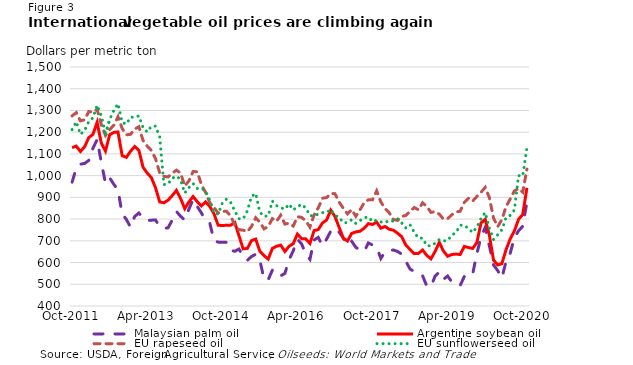
| Category | Malaysian | Argentine | EU |
|---|---|---|---|
| 2011-10-01 | 970 | 1129 | 1212 |
| 2011-11-01 | 1034 | 1136 | 1248 |
| 2011-12-01 | 1053 | 1111 | 1190 |
| 2012-01-01 | 1056 | 1133 | 1208 |
| 2012-02-01 | 1070 | 1175 | 1249 |
| 2012-03-01 | 1126 | 1190 | 1266 |
| 2012-04-01 | 1166 | 1245 | 1324 |
| 2012-05-01 | 1062 | 1150 | 1275 |
| 2012-06-01 | 965 | 1113 | 1192 |
| 2012-07-01 | 990 | 1188 | 1258 |
| 2012-08-01 | 960 | 1199 | 1300 |
| 2012-09-01 | 935 | 1201 | 1331 |
| 2012-10-01 | 823 | 1092 | 1245 |
| 2012-11-01 | 799 | 1084 | 1237 |
| 2012-12-01 | 763 | 1112 | 1269 |
| 2013-01-01 | 812 | 1134 | 1269 |
| 2013-02-01 | 828 | 1117 | 1275 |
| 2013-03-01 | 804 | 1039 | 1221 |
| 2013-04-01 | 793 | 1012 | 1201 |
| 2013-05-01 | 795 | 991 | 1227 |
| 2013-06-01 | 796 | 944 | 1228 |
| 2013-07-01 | 765 | 879 | 1178 |
| 2013-08-01 | 757 | 875 | 959 |
| 2013-09-01 | 760 | 887 | 962 |
| 2013-10-01 | 795 | 908 | 988 |
| 2013-11-01 | 835 | 932 | 998 |
| 2013-12-01 | 813 | 895 | 982 |
| 2014-01-01 | 796 | 848 | 920 |
| 2014-02-01 | 846 | 879 | 945 |
| 2014-03-01 | 890 | 904 | 964 |
| 2014-04-01 | 858 | 880 | 941 |
| 2014-05-01 | 828 | 861 | 943 |
| 2014-06-01 | 793 | 879 | 928 |
| 2014-07-01 | 782 | 858 | 887 |
| 2014-08-01 | 701 | 825 | 828 |
| 2014-09-01 | 694 | 772 | 823 |
| 2014-10-01 | 693 | 770 | 874 |
| 2014-11-01 | 693 | 772 | 892 |
| 2014-12-01 | 656 | 772 | 877 |
| 2015-01-01 | 652 | 784 | 837 |
| 2015-02-01 | 662 | 723 | 802 |
| 2015-03-01 | 629 | 663 | 801 |
| 2015-04-01 | 610 | 665 | 838 |
| 2015-05-01 | 628 | 701 | 904 |
| 2015-06-01 | 638 | 708 | 918 |
| 2015-07-01 | 610 | 652 | 832 |
| 2015-08-01 | 524 | 632 | 812 |
| 2015-09-01 | 521 | 616 | 815 |
| 2015-10-01 | 565 | 665 | 883 |
| 2015-11-01 | 541 | 675 | 862 |
| 2015-12-01 | 539 | 680 | 852 |
| 2016-01-01 | 550 | 651 | 846 |
| 2016-02-01 | 613 | 675 | 869 |
| 2016-03-01 | 654 | 687 | 842 |
| 2016-04-01 | 707 | 731 | 857 |
| 2016-05-01 | 686 | 710 | 868 |
| 2016-06-01 | 640 | 709 | 851 |
| 2016-07-01 | 615 | 688 | 816 |
| 2016-08-01 | 704 | 747 | 815 |
| 2016-09-01 | 716 | 752 | 823 |
| 2016-10-01 | 677 | 782 | 830 |
| 2016-11-01 | 708 | 796 | 830 |
| 2016-12-01 | 745 | 841 | 844 |
| 2017-01-01 | 759 | 812 | 817 |
| 2017-02-01 | 740 | 762 | 808 |
| 2017-03-01 | 713 | 712 | 783 |
| 2017-04-01 | 681 | 699 | 784 |
| 2017-05-01 | 698 | 734 | 797 |
| 2017-06-01 | 670 | 741 | 780 |
| 2017-07-01 | 658 | 744 | 793 |
| 2017-08-01 | 651 | 758 | 806 |
| 2017-09-01 | 690 | 779 | 810 |
| 2017-10-01 | 681 | 775 | 788 |
| 2017-11-01 | 670 | 786 | 795 |
| 2017-12-01 | 619 | 758 | 787 |
| 2018-01-01 | 650 | 766 | 784 |
| 2018-02-01 | 654 | 753 | 794 |
| 2018-03-01 | 658 | 749 | 790 |
| 2018-04-01 | 651 | 735 | 802 |
| 2018-05-01 | 639 | 719 | 782 |
| 2018-06-01 | 605 | 680 | 759 |
| 2018-07-01 | 570 | 660 | 774 |
| 2018-08-01 | 559 | 641 | 739 |
| 2018-09-01 | 552 | 642 | 713 |
| 2018-10-01 | 539 | 658 | 712 |
| 2018-11-01 | 492 | 633 | 678 |
| 2018-12-01 | 489 | 617 | 676 |
| 2019-01-01 | 538 | 651 | 689 |
| 2019-02-01 | 556 | 693 | 706 |
| 2019-03-01 | 523 | 653 | 700 |
| 2019-04-01 | 538 | 629 | 701 |
| 2019-05-01 | 511 | 637 | 726 |
| 2019-06-01 | 502 | 639 | 738 |
| 2019-07-01 | 494 | 637 | 772 |
| 2019-08-01 | 536 | 674 | 772 |
| 2019-09-01 | 532 | 669 | 756 |
| 2019-10-01 | 547 | 665 | 738 |
| 2019-11-01 | 641 | 692 | 763 |
| 2019-12-01 | 718 | 782 | 802 |
| 2020-01-01 | 761 | 799 | 830 |
| 2020-02-01 | 677 | 726 | 759 |
| 2020-03-01 | 589 | 611 | 706 |
| 2020-04-01 | 563 | 589 | 728 |
| 2020-05-01 | 529 | 595 | 751 |
| 2020-06-01 | 605 | 659 | 807 |
| 2020-07-01 | 643 | 709 | 817 |
| 2020-08-01 | 715 | 746 | 842 |
| 2020-09-01 | 746 | 799 | 1000 |
| 2020-10-01 | 767 | 821 | 999 |
| 2020-11-01 | 878 | 944 | 1129 |